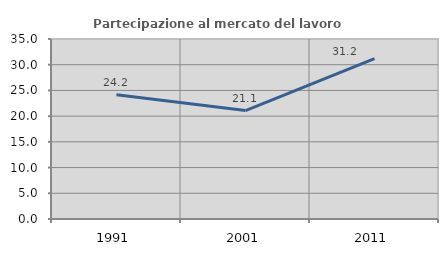
| Category | Partecipazione al mercato del lavoro  femminile |
|---|---|
| 1991.0 | 24.161 |
| 2001.0 | 21.094 |
| 2011.0 | 31.193 |